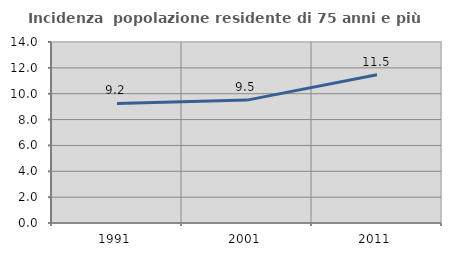
| Category | Incidenza  popolazione residente di 75 anni e più |
|---|---|
| 1991.0 | 9.248 |
| 2001.0 | 9.505 |
| 2011.0 | 11.467 |